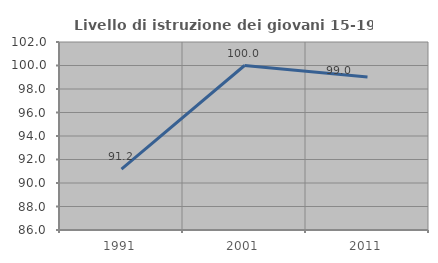
| Category | Livello di istruzione dei giovani 15-19 anni |
|---|---|
| 1991.0 | 91.176 |
| 2001.0 | 100 |
| 2011.0 | 99.02 |